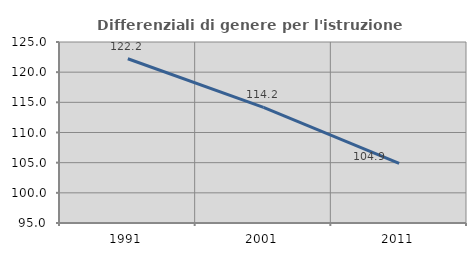
| Category | Differenziali di genere per l'istruzione superiore |
|---|---|
| 1991.0 | 122.227 |
| 2001.0 | 114.162 |
| 2011.0 | 104.886 |